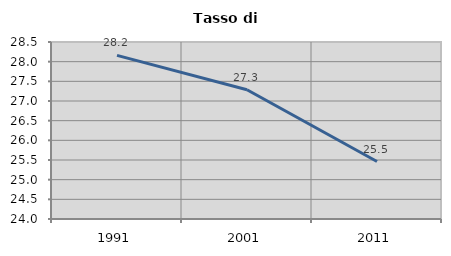
| Category | Tasso di disoccupazione   |
|---|---|
| 1991.0 | 28.16 |
| 2001.0 | 27.285 |
| 2011.0 | 25.462 |